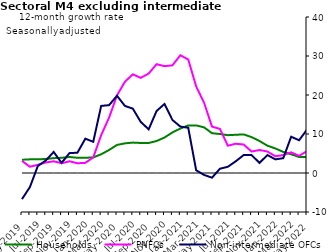
| Category | zero | Households | PNFCs | Non-intermediate OFCs |
|---|---|---|---|---|
| May-2019 | 0 | 3.4 | 3.1 | -6.7 |
| Jun-2019 | 0 | 3.5 | 1.6 | -3.6 |
| Jul-2019 | 0 | 3.5 | 2.1 | 1.8 |
| Aug-2019 | 0 | 3.6 | 2.7 | 3.2 |
| Sep-2019 | 0 | 3.8 | 3 | 5.4 |
| Oct-2019 | 0 | 3.9 | 2.5 | 2.6 |
| Nov-2019 | 0 | 4.1 | 3 | 5.1 |
| Dec-2019 | 0 | 3.9 | 2.5 | 5.2 |
| Jan-2020 | 0 | 3.9 | 2.6 | 8.8 |
| Feb-2020 | 0 | 4 | 4 | 8 |
| Mar-2020 | 0 | 4.8 | 9.7 | 17.2 |
| Apr-2020 | 0 | 5.9 | 14.2 | 17.4 |
| May-2020 | 0 | 7.2 | 19.9 | 19.8 |
| Jun-2020 | 0 | 7.6 | 23.4 | 17.2 |
| Jul-2020 | 0 | 7.8 | 25.3 | 16.5 |
| Aug-2020 | 0 | 7.7 | 24.4 | 13.1 |
| Sep-2020 | 0 | 7.7 | 25.5 | 11.2 |
| Oct-2020 | 0 | 8.2 | 27.9 | 15.9 |
| Nov-2020 | 0 | 9.1 | 27.4 | 17.7 |
| Dec-2020 | 0 | 10.4 | 27.6 | 13.6 |
| Jan-2021 | 0 | 11.4 | 30.2 | 11.9 |
| Feb-2021 | 0 | 12.2 | 29.1 | 11.6 |
| Mar-2021 | 0 | 12.2 | 22.2 | 0.7 |
| Apr-2021 | 0 | 11.7 | 18 | -0.5 |
| May-2021 | 0 | 10.2 | 11.9 | -1.2 |
| Jun-2021 | 0 | 10 | 11.3 | 1.1 |
| Jul-2021 | 0 | 9.7 | 7 | 1.6 |
| Aug-2021 | 0 | 9.8 | 7.5 | 3 |
| Sep-2021 | 0 | 9.9 | 7.3 | 4.6 |
| Oct-2021 | 0 | 9.2 | 5.5 | 4.6 |
| Nov-2021 | 0 | 8.2 | 5.9 | 2.6 |
| Dec-2021 | 0 | 7 | 5.5 | 4.6 |
| Jan-2022 | 0 | 6.3 | 4.3 | 3.5 |
| Feb-2022 | 0 | 5.4 | 4.6 | 3.8 |
| Mar-2022 | 0 | 4.8 | 5.3 | 9.3 |
| Apr-2022 | 0 | 4.1 | 4.4 | 8.4 |
| May-2022 | 0 | 4.1 | 5.6 | 11.1 |